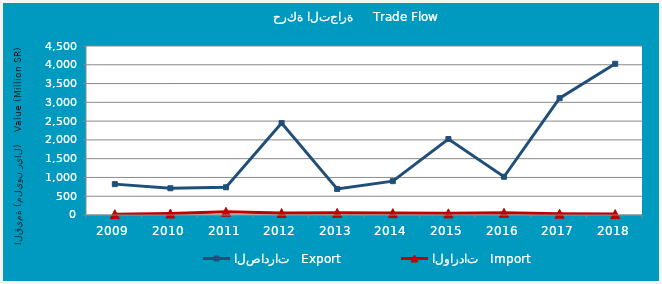
| Category | الصادرات   Export | الواردات   Import |
|---|---|---|
| 2009.0 | 822096637 | 21218843 |
| 2010.0 | 712492312 | 40033651 |
| 2011.0 | 738257271 | 85322885 |
| 2012.0 | 2447251352 | 52013622 |
| 2013.0 | 694640404 | 57508289 |
| 2014.0 | 900991094 | 50062702 |
| 2015.0 | 2022234344 | 43954174 |
| 2016.0 | 1018622539 | 58308588 |
| 2017.0 | 3110561764 | 33271545 |
| 2018.0 | 4026516794 | 25766338 |